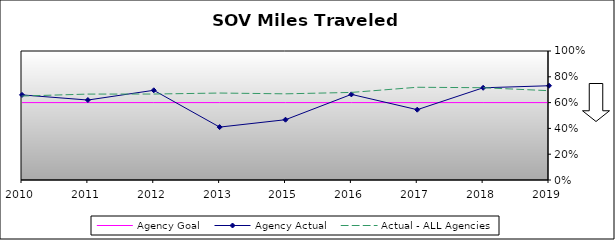
| Category | Agency Goal | Agency Actual | Actual - ALL Agencies |
|---|---|---|---|
| 2010.0 | 0.6 | 0.66 | 0.651 |
| 2011.0 | 0.6 | 0.62 | 0.666 |
| 2012.0 | 0.6 | 0.695 | 0.666 |
| 2013.0 | 0.6 | 0.41 | 0.674 |
| 2015.0 | 0.6 | 0.467 | 0.668 |
| 2016.0 | 0.6 | 0.664 | 0.679 |
| 2017.0 | 0.6 | 0.545 | 0.719 |
| 2018.0 | 0.6 | 0.715 | 0.715 |
| 2019.0 | 0.6 | 0.731 | 0.692 |